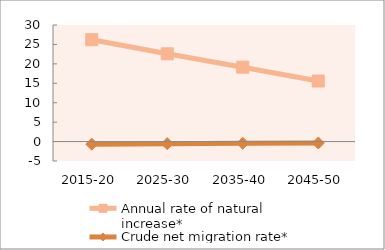
| Category | Annual rate of natural increase* | Crude net migration rate* |
|---|---|---|
| 2015-20 | 26.211 | -0.678 |
| 2025-30 | 22.582 | -0.534 |
| 2035-40 | 19.142 | -0.436 |
| 2045-50 | 15.582 | -0.368 |